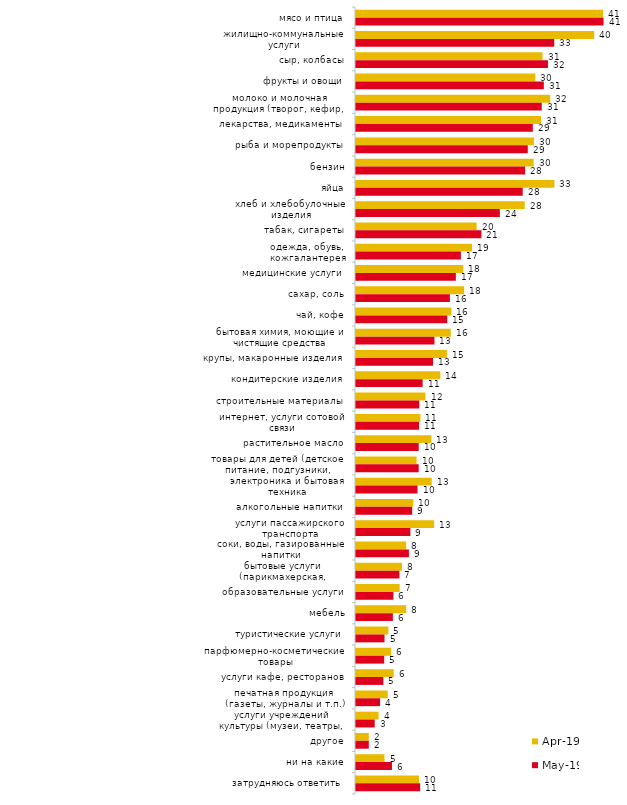
| Category | апр.19 | май.19 |
|---|---|---|
| мясо и птица | 41.188 | 41.258 |
| жилищно-коммунальные услуги | 39.703 | 33.036 |
| сыр, колбасы | 31.089 | 31.996 |
| фрукты и овощи | 29.901 | 31.303 |
| молоко и молочная продукция (творог, кефир, масло и т.д.) | 32.376 | 30.956 |
| лекарства, медикаменты | 30.842 | 29.47 |
| рыба и морепродукты | 29.653 | 28.628 |
| бензин | 29.604 | 28.182 |
| яйца | 33.069 | 27.786 |
| хлеб и хлебобулочные изделия | 28.119 | 23.972 |
| табак, сигареты | 20.099 | 20.901 |
| одежда, обувь, кожгалантерея | 19.356 | 17.484 |
| медицинские услуги | 17.871 | 16.642 |
| сахар, соль | 18.02 | 15.651 |
| чай, кофе | 15.891 | 15.206 |
| бытовая химия, моющие и чистящие средства | 15.792 | 13.076 |
| крупы, макаронные изделия | 15.149 | 12.828 |
| кондитерские изделия | 14.059 | 11.095 |
| строительные материалы | 11.584 | 10.55 |
| интернет, услуги сотовой связи | 10.743 | 10.5 |
| растительное масло | 12.574 | 10.451 |
| товары для детей (детское питание, подгузники, игрушки и т.п.) | 10.099 | 10.451 |
| электроника и бытовая техника | 12.624 | 10.253 |
| алкогольные напитки | 9.554 | 9.361 |
| услуги пассажирского транспорта | 13.02 | 9.064 |
| соки, воды, газированные напитки | 8.366 | 8.816 |
| бытовые услуги (парикмахерская, химчистка, ателье и т.д.) | 7.673 | 7.231 |
| образовательные услуги | 7.277 | 6.241 |
| мебель | 8.366 | 6.142 |
| туристические услуги | 5.396 | 4.755 |
| парфюмерно-косметические товары | 5.842 | 4.705 |
| услуги кафе, ресторанов | 6.287 | 4.557 |
| печатная продукция (газеты, журналы и т.п.) | 5.297 | 4.012 |
| услуги учреждений культуры (музеи, театры, кинотеатры и т.п.) | 3.762 | 3.12 |
| другое | 2.129 | 2.13 |
| ни на какие | 4.752 | 5.993 |
| затрудняюсь ответить | 10.495 | 10.698 |